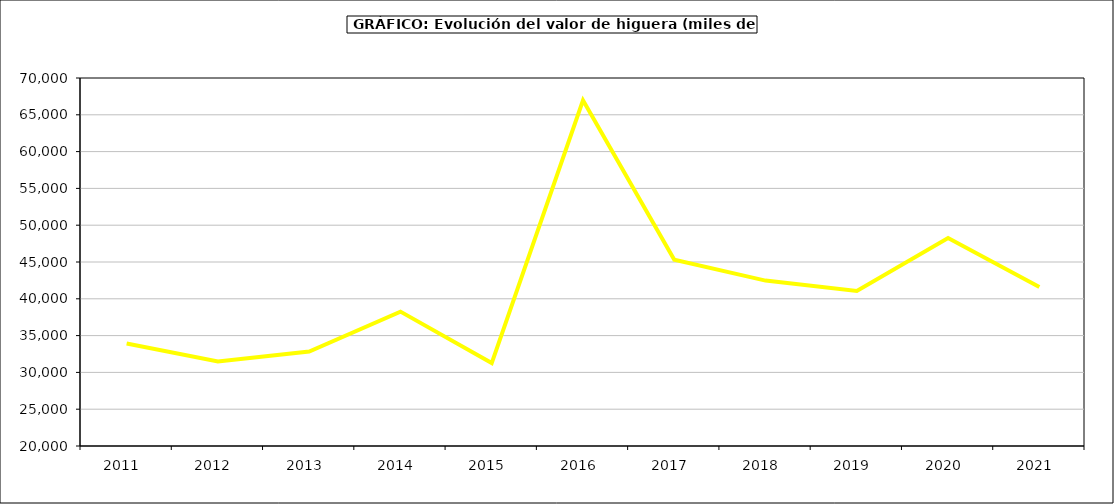
| Category | valor higuera |
|---|---|
| 2011.0 | 33937.485 |
| 2012.0 | 31478.992 |
| 2013.0 | 32844.373 |
| 2014.0 | 38257.221 |
| 2015.0 | 31266 |
| 2016.0 | 66968 |
| 2017.0 | 45296.738 |
| 2018.0 | 42473.625 |
| 2019.0 | 41072.008 |
| 2020.0 | 48249.45 |
| 2021.0 | 41603.947 |